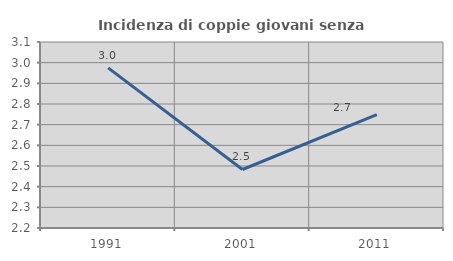
| Category | Incidenza di coppie giovani senza figli |
|---|---|
| 1991.0 | 2.975 |
| 2001.0 | 2.483 |
| 2011.0 | 2.748 |